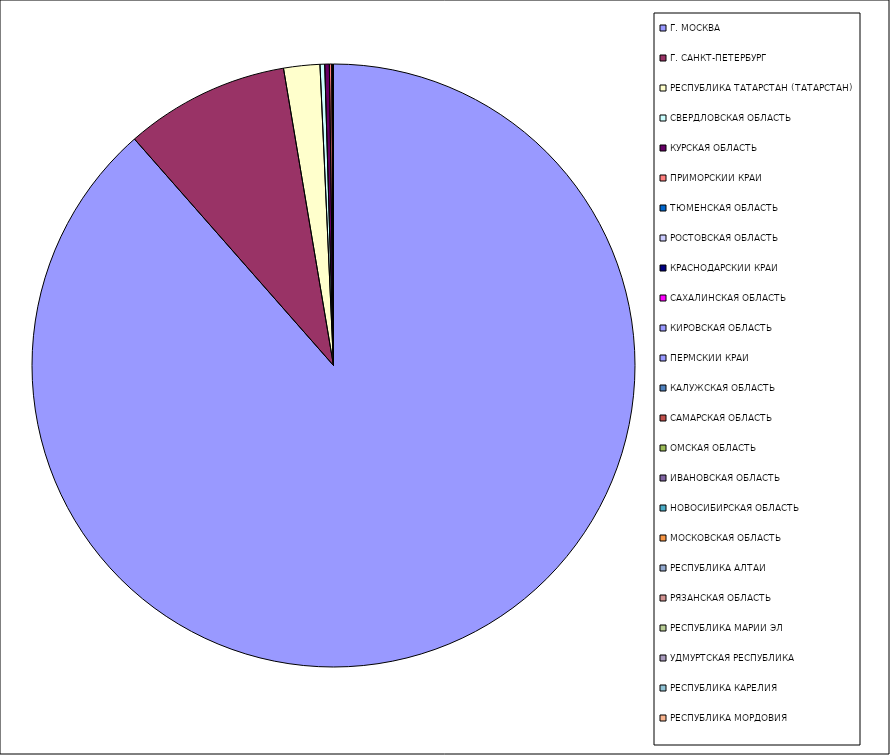
| Category | Оборот |
|---|---|
| Г. МОСКВА | 88.519 |
| Г. САНКТ-ПЕТЕРБУРГ | 8.821 |
| РЕСПУБЛИКА ТАТАРСТАН (ТАТАРСТАН) | 1.939 |
| СВЕРДЛОВСКАЯ ОБЛАСТЬ | 0.252 |
| КУРСКАЯ ОБЛАСТЬ | 0.245 |
| ПРИМОРСКИЙ КРАЙ | 0.131 |
| ТЮМЕНСКАЯ ОБЛАСТЬ | 0.017 |
| РОСТОВСКАЯ ОБЛАСТЬ | 0.015 |
| КРАСНОДАРСКИЙ КРАЙ | 0.008 |
| САХАЛИНСКАЯ ОБЛАСТЬ | 0.008 |
| КИРОВСКАЯ ОБЛАСТЬ | 0.006 |
| ПЕРМСКИЙ КРАЙ | 0.005 |
| КАЛУЖСКАЯ ОБЛАСТЬ | 0.004 |
| САМАРСКАЯ ОБЛАСТЬ | 0.004 |
| ОМСКАЯ ОБЛАСТЬ | 0.004 |
| ИВАНОВСКАЯ ОБЛАСТЬ | 0.004 |
| НОВОСИБИРСКАЯ ОБЛАСТЬ | 0.003 |
| МОСКОВСКАЯ ОБЛАСТЬ | 0.003 |
| РЕСПУБЛИКА АЛТАЙ | 0.003 |
| РЯЗАНСКАЯ ОБЛАСТЬ | 0.002 |
| РЕСПУБЛИКА МАРИЙ ЭЛ | 0.001 |
| УДМУРТСКАЯ РЕСПУБЛИКА | 0.001 |
| РЕСПУБЛИКА КАРЕЛИЯ | 0.001 |
| РЕСПУБЛИКА МОРДОВИЯ | 0.001 |